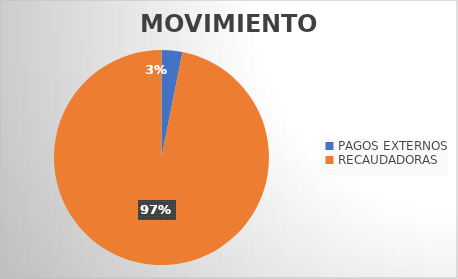
| Category | MOVIMIENTOS |
|---|---|
| PAGOS EXTERNOS | 619 |
| RECAUDADORAS | 19113 |